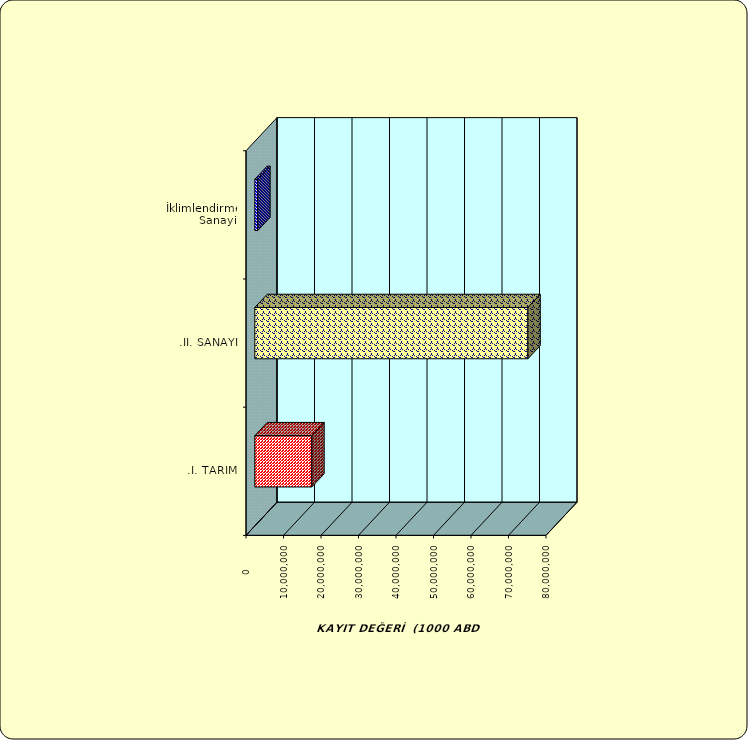
| Category | Series 0 |
|---|---|
| .I. TARIM | 15202297.792 |
| .II. SANAYİ | 72835633.872 |
|  İklimlendirme Sanayii | 789719.546 |